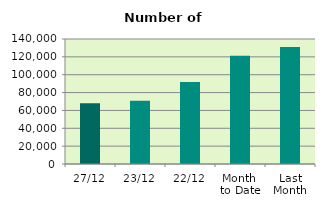
| Category | Series 0 |
|---|---|
| 27/12 | 68166 |
| 23/12 | 70926 |
| 22/12 | 91782 |
| Month 
to Date | 121343.444 |
| Last
Month | 131016.636 |